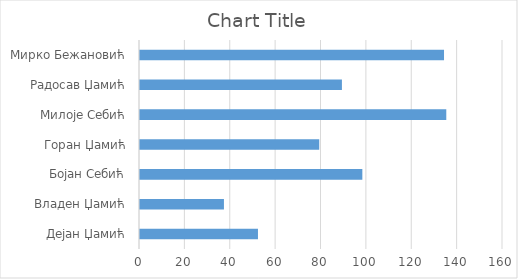
| Category | Series 0 |
|---|---|
| Дејан Џамић | 52 |
| Владен Џамић | 37 |
| Бојан Себић | 98 |
| Горан Џамић | 79 |
| Милоје Себић | 135 |
| Радосав Џамић | 89 |
| Мирко Бежановић | 134 |